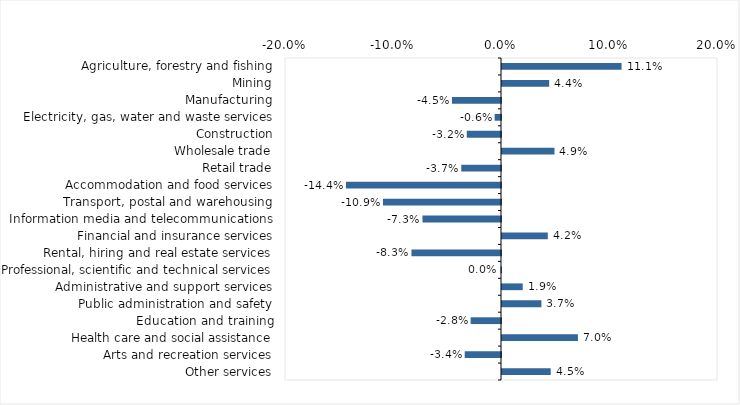
| Category | This week |
|---|---|
| Agriculture, forestry and fishing | 0.111 |
| Mining | 0.044 |
| Manufacturing | -0.045 |
| Electricity, gas, water and waste services | -0.006 |
| Construction | -0.032 |
| Wholesale trade | 0.049 |
| Retail trade | -0.037 |
| Accommodation and food services | -0.144 |
| Transport, postal and warehousing | -0.109 |
| Information media and telecommunications | -0.073 |
| Financial and insurance services | 0.042 |
| Rental, hiring and real estate services | -0.083 |
| Professional, scientific and technical services | 0 |
| Administrative and support services | 0.019 |
| Public administration and safety | 0.036 |
| Education and training | -0.028 |
| Health care and social assistance | 0.07 |
| Arts and recreation services | -0.034 |
| Other services | 0.045 |